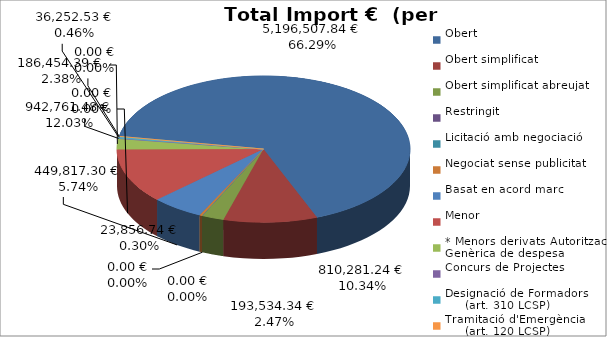
| Category | Total preu
(amb IVA) |
|---|---|
| Obert | 5196507.84 |
| Obert simplificat | 810281.24 |
| Obert simplificat abreujat | 193534.34 |
| Restringit | 0 |
| Licitació amb negociació | 0 |
| Negociat sense publicitat | 23856.74 |
| Basat en acord marc | 449817.3 |
| Menor | 942761.48 |
| * Menors derivats Autorització Genèrica de despesa | 186454.39 |
| Concurs de Projectes | 0 |
| Designació de Formadors
     (art. 310 LCSP) | 36252.53 |
| Tramitació d'Emergència
     (art. 120 LCSP) | 0 |